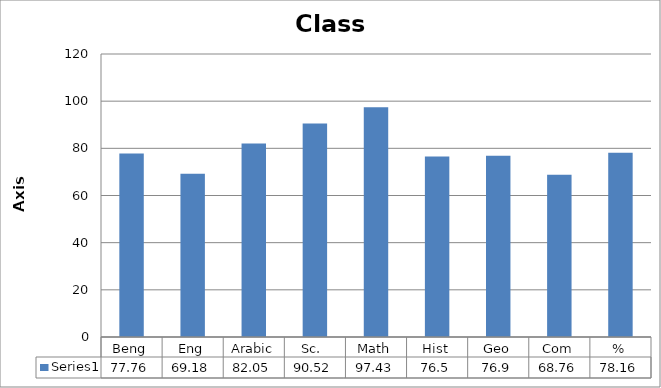
| Category | Series 0 |
|---|---|
| Beng | 77.76 |
| Eng | 69.18 |
| Arabic | 82.05 |
| Sc.  | 90.52 |
| Math | 97.43 |
| Hist | 76.5 |
| Geo | 76.9 |
| Com | 68.76 |
| % | 78.16 |